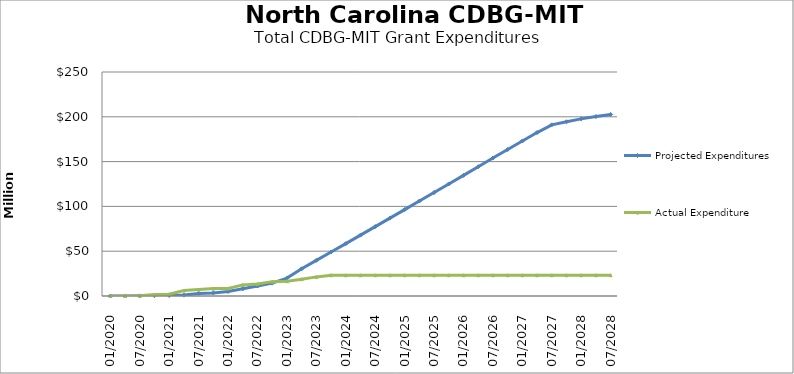
| Category | Projected Expenditures | Actual Expenditure |
|---|---|---|
| 01/2020 | 18934.446 | 0 |
| 04/2020 | 37847.561 | 0 |
| 07/2020 | 161413.244 | 274138.69 |
| 10/2020 | 353066.139 | 1630136.56 |
| 01/2021 | 574980.018 | 2069610.51 |
| 04/2021 | 993687.28 | 6125089.88 |
| 07/2021 | 2859148.887 | 7206271.93 |
| 10/2021 | 3482291.231 | 8249729 |
| 01/2022 | 5040955.542 | 8337416.56 |
| 04/2022 | 8046363.257 | 12423148.85 |
| 07/2022 | 11123640.807 | 13357397.11 |
| 10/2022 | 14360918.358 | 16041167.66 |
| 01/2023 | 19993881.494 | 16544013.24 |
| 04/2023 | 30357294.196 | 18803902.85 |
| 07/2023 | 39770706.898 | 21331656.97 |
| 10/2023 | 49134119.6 | 23165500.03 |
| 01/2024 | 58397532.302 | 23165500.03 |
| 04/2024 | 67910945.004 | 23165500.03 |
| 07/2024 | 77424357.706 | 23165500.03 |
| 10/2024 | 86937770.409 | 23165500.03 |
| 01/2025 | 96451183.111 | 23165500.03 |
| 04/2025 | 105964595.813 | 23165500.03 |
| 07/2025 | 115478008.515 | 23165500.03 |
| 10/2025 | 125041421.217 | 23165500.03 |
| 01/2026 | 134604833.919 | 23165500.03 |
| 04/2026 | 144268246.621 | 23165500.03 |
| 07/2026 | 153931659.323 | 23165500.03 |
| 10/2026 | 163495072.025 | 23165500.03 |
| 01/2027 | 173008484.727 | 23165500.03 |
| 04/2027 | 182421897.429 | 23165500.03 |
| 07/2027 | 191070154.995 | 23165500.03 |
| 10/2027 | 194486003.181 | 23165500.03 |
| 01/2028 | 197701851.367 | 23165500.03 |
| 04/2028 | 200251655.884 | 23165500.03 |
| 07/2028 | 202636014.736 | 23165500.03 |